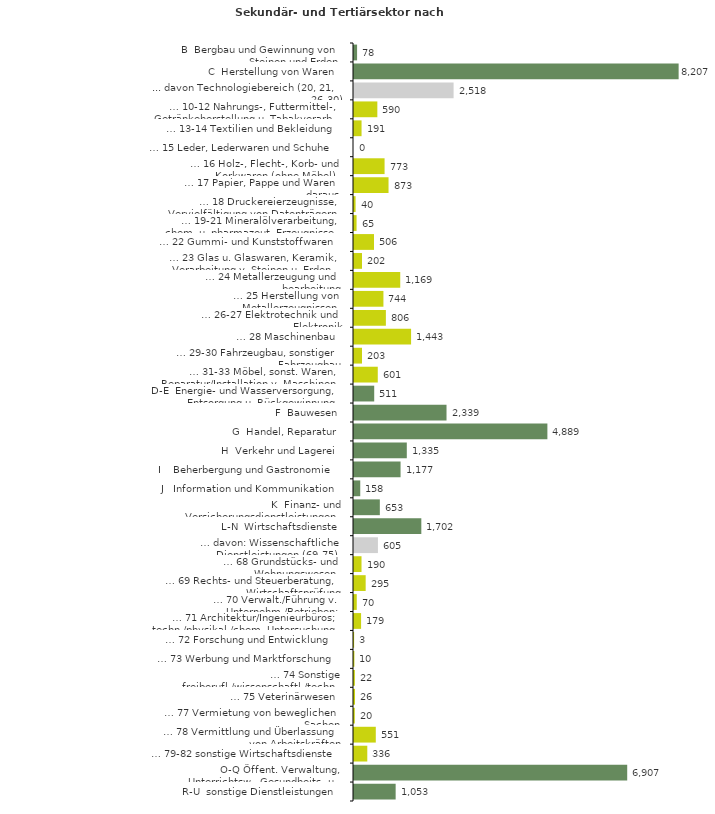
| Category | Series 0 |
|---|---|
| B  Bergbau und Gewinnung von Steinen und Erden | 78 |
| C  Herstellung von Waren | 8207 |
| ... davon Technologiebereich (20, 21, 26-30) | 2518 |
| … 10-12 Nahrungs-, Futtermittel-, Getränkeherstellung u. Tabakverarb. | 590 |
| … 13-14 Textilien und Bekleidung | 191 |
| … 15 Leder, Lederwaren und Schuhe | 0 |
| … 16 Holz-, Flecht-, Korb- und Korkwaren (ohne Möbel)  | 773 |
| … 17 Papier, Pappe und Waren daraus  | 873 |
| … 18 Druckereierzeugnisse, Vervielfältigung von Datenträgern | 40 |
| … 19-21 Mineralölverarbeitung, chem. u. pharmazeut. Erzeugnisse | 65 |
| … 22 Gummi- und Kunststoffwaren | 506 |
| … 23 Glas u. Glaswaren, Keramik, Verarbeitung v. Steinen u. Erden  | 202 |
| … 24 Metallerzeugung und -bearbeitung | 1169 |
| … 25 Herstellung von Metallerzeugnissen  | 744 |
| … 26-27 Elektrotechnik und Elektronik | 806 |
| … 28 Maschinenbau | 1443 |
| … 29-30 Fahrzeugbau, sonstiger Fahrzeugbau | 203 |
| … 31-33 Möbel, sonst. Waren, Reparatur/Installation v. Maschinen | 601 |
| D-E  Energie- und Wasserversorgung, Entsorgung u. Rückgewinnung | 511 |
| F  Bauwesen | 2339 |
| G  Handel, Reparatur | 4889 |
| H  Verkehr und Lagerei | 1335 |
| I    Beherbergung und Gastronomie | 1177 |
| J   Information und Kommunikation | 158 |
| K  Finanz- und Versicherungsdienstleistungen | 653 |
| L-N  Wirtschaftsdienste | 1702 |
| … davon: Wissenschaftliche Dienstleistungen (69-75) | 605 |
| … 68 Grundstücks- und Wohnungswesen  | 190 |
| … 69 Rechts- und Steuerberatung, Wirtschaftsprüfung | 295 |
| … 70 Verwalt./Führung v. Unternehm./Betrieben; Unternehmensberat. | 70 |
| … 71 Architektur/Ingenieurbüros; techn./physikal./chem. Untersuchung | 179 |
| … 72 Forschung und Entwicklung  | 3 |
| … 73 Werbung und Marktforschung | 10 |
| … 74 Sonstige freiberufl./wissenschaftl./techn. Tätigkeiten | 22 |
| … 75 Veterinärwesen | 26 |
| … 77 Vermietung von beweglichen Sachen  | 20 |
| … 78 Vermittlung und Überlassung von Arbeitskräften | 551 |
| … 79-82 sonstige Wirtschaftsdienste | 336 |
| O-Q Öffent. Verwaltung, Unterrichtsw., Gesundheits- u. Sozialwesen | 6907 |
| R-U  sonstige Dienstleistungen | 1053 |